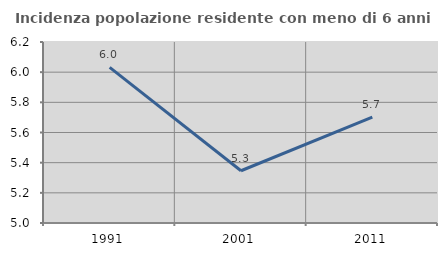
| Category | Incidenza popolazione residente con meno di 6 anni |
|---|---|
| 1991.0 | 6.032 |
| 2001.0 | 5.346 |
| 2011.0 | 5.703 |